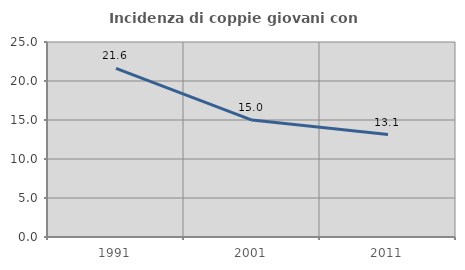
| Category | Incidenza di coppie giovani con figli |
|---|---|
| 1991.0 | 21.616 |
| 2001.0 | 14.99 |
| 2011.0 | 13.135 |